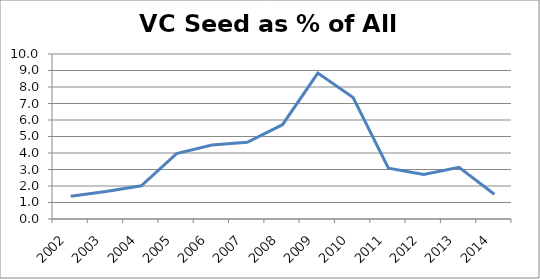
| Category | VC Seed as % of All VC |
|---|---|
| 2002.0 | 1.383 |
| 2003.0 | 1.661 |
| 2004.0 | 2.012 |
| 2005.0 | 3.963 |
| 2006.0 | 4.479 |
| 2007.0 | 4.653 |
| 2008.0 | 5.714 |
| 2009.0 | 8.843 |
| 2010.0 | 7.358 |
| 2011.0 | 3.076 |
| 2012.0 | 2.696 |
| 2013.0 | 3.133 |
| 2014.0 | 1.502 |